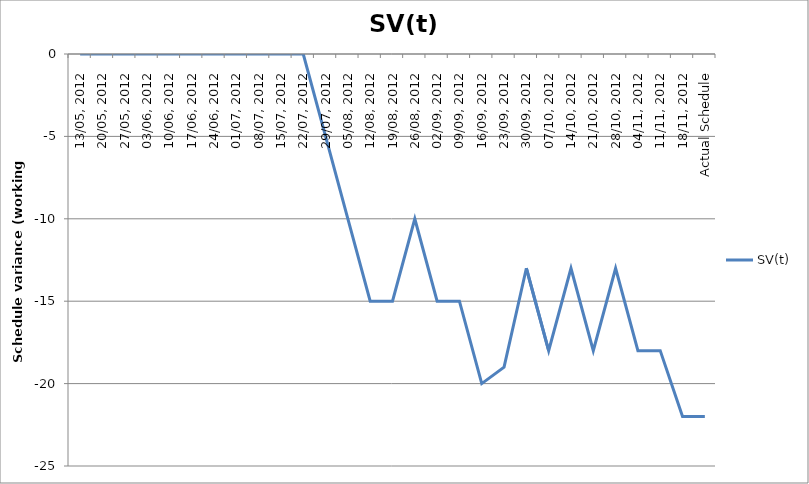
| Category | SV(t) |
|---|---|
| 13/05, 2012 | 0 |
| 20/05, 2012 | 0 |
| 27/05, 2012 | 0 |
| 03/06, 2012 | 0 |
| 10/06, 2012 | 0 |
| 17/06, 2012 | 0 |
| 24/06, 2012 | 0 |
| 01/07, 2012 | 0 |
| 08/07, 2012 | 0 |
| 15/07, 2012 | 0 |
| 22/07, 2012 | 0 |
| 29/07, 2012 | -5 |
| 05/08, 2012 | -10 |
| 12/08, 2012 | -15 |
| 19/08, 2012 | -15 |
| 26/08, 2012 | -10 |
| 02/09, 2012 | -15 |
| 09/09, 2012 | -15 |
| 16/09, 2012 | -20 |
| 23/09, 2012 | -19 |
| 30/09, 2012 | -13 |
| 07/10, 2012 | -18 |
| 14/10, 2012 | -13 |
| 21/10, 2012 | -18 |
| 28/10, 2012 | -13 |
| 04/11, 2012 | -18 |
| 11/11, 2012 | -18 |
| 18/11, 2012 | -22 |
| Actual Schedule | -22 |